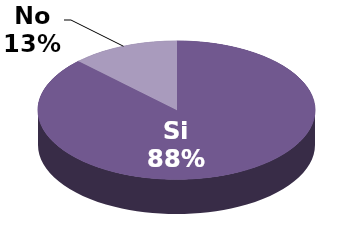
| Category | Series 1 |
|---|---|
| Si | 21 |
| No | 3 |